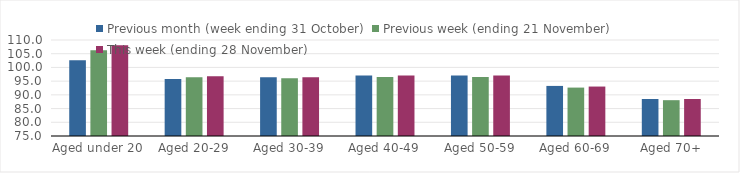
| Category | Previous month (week ending 31 October) | Previous week (ending 21 November) | This week (ending 28 November) |
|---|---|---|---|
| Aged under 20 | 102.64 | 106.26 | 108.08 |
| Aged 20-29 | 95.75 | 96.39 | 96.75 |
| Aged 30-39 | 96.45 | 96.05 | 96.4 |
| Aged 40-49 | 97.1 | 96.55 | 97.1 |
| Aged 50-59 | 97.02 | 96.47 | 97.03 |
| Aged 60-69 | 93.26 | 92.65 | 93.03 |
| Aged 70+ | 88.5 | 88.06 | 88.5 |